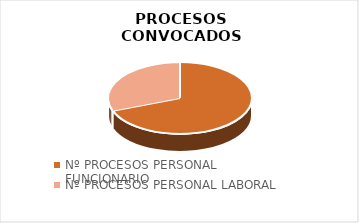
| Category | Series 0 |
|---|---|
| Nº PROCESOS PERSONAL FUNCIONARIO | 27 |
| Nº PROCESOS PERSONAL LABORAL | 12 |